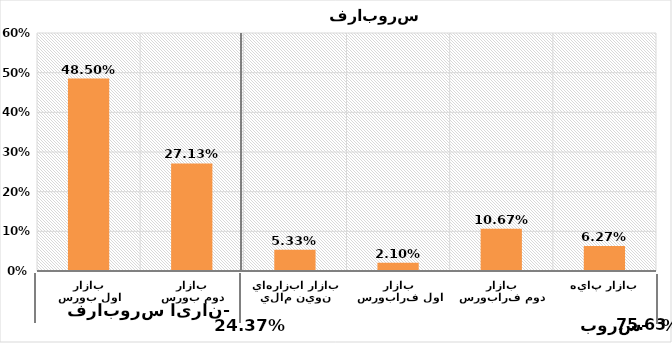
| Category | Series 0 |
|---|---|
| بازار اول بورس | 0.485 |
| بازار دوم بورس | 0.271 |
| بازار ابزارهاي نوين مالي | 0.053 |
| بازار اول فرابورس | 0.021 |
| بازار دوم فرابورس | 0.107 |
| بازار پايه | 0.063 |